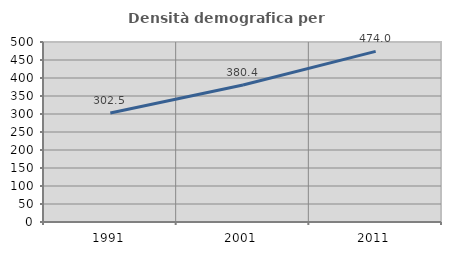
| Category | Densità demografica |
|---|---|
| 1991.0 | 302.541 |
| 2001.0 | 380.446 |
| 2011.0 | 473.976 |